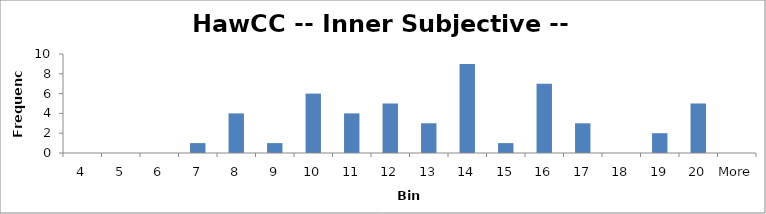
| Category | Frequency |
|---|---|
| 4 | 0 |
| 5 | 0 |
| 6 | 0 |
| 7 | 1 |
| 8 | 4 |
| 9 | 1 |
| 10 | 6 |
| 11 | 4 |
| 12 | 5 |
| 13 | 3 |
| 14 | 9 |
| 15 | 1 |
| 16 | 7 |
| 17 | 3 |
| 18 | 0 |
| 19 | 2 |
| 20 | 5 |
| More | 0 |